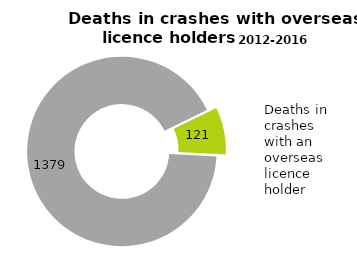
| Category | Series 0 |
|---|---|
| Deaths in crashes with an overseas driver | 121 |
| Other | 1379 |